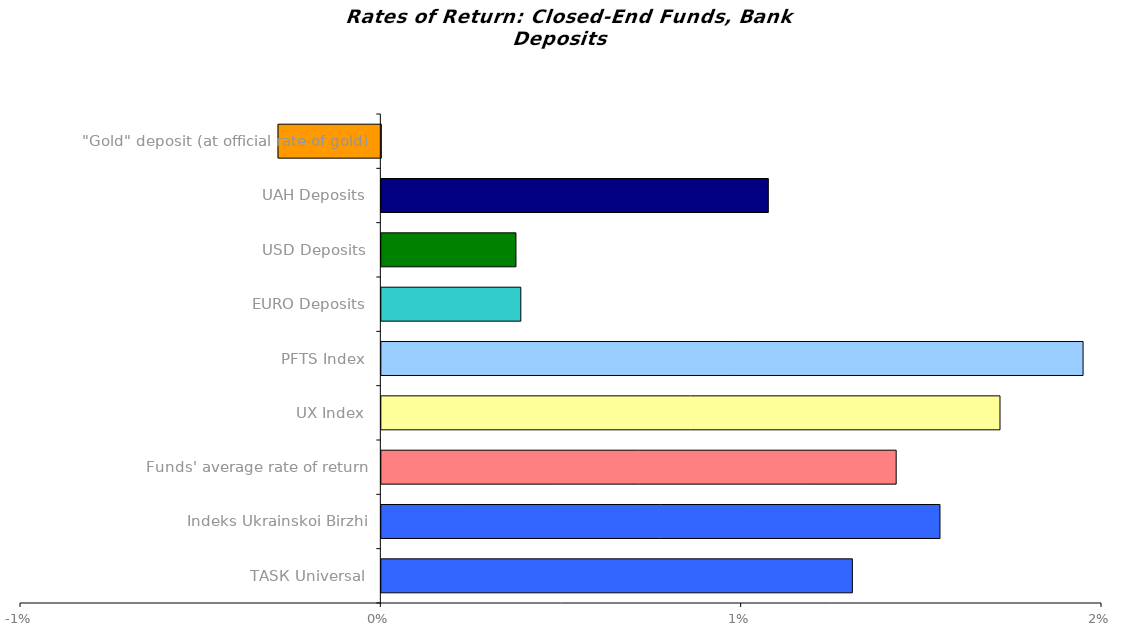
| Category | Series 0 |
|---|---|
| ТАSК Universal | 0.013 |
| Іndeks Ukrainskoi Birzhi | 0.016 |
| Funds' average rate of return | 0.014 |
| UX Index | 0.017 |
| PFTS Index | 0.019 |
| EURO Deposits | 0.004 |
| USD Deposits | 0.004 |
| UAH Deposits | 0.011 |
| "Gold" deposit (at official rate of gold) | -0.003 |